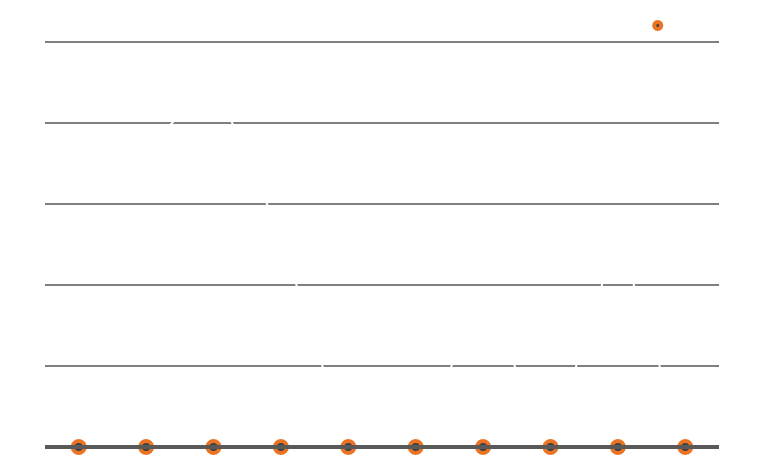
| Category | Km kjørt |
|---|---|
| 5/1/12 | 162 |
| 5/2/12 | 183 |
| 5/3/12 | 227 |
| 5/4/12 | 130 |
| 5/5/12 | 0 |
| 5/6/12 | 0 |
| 5/7/12 | 94 |
| 5/8/12 | 0 |
| 5/9/12 | 131 |
| 5/10/12 | 0 |